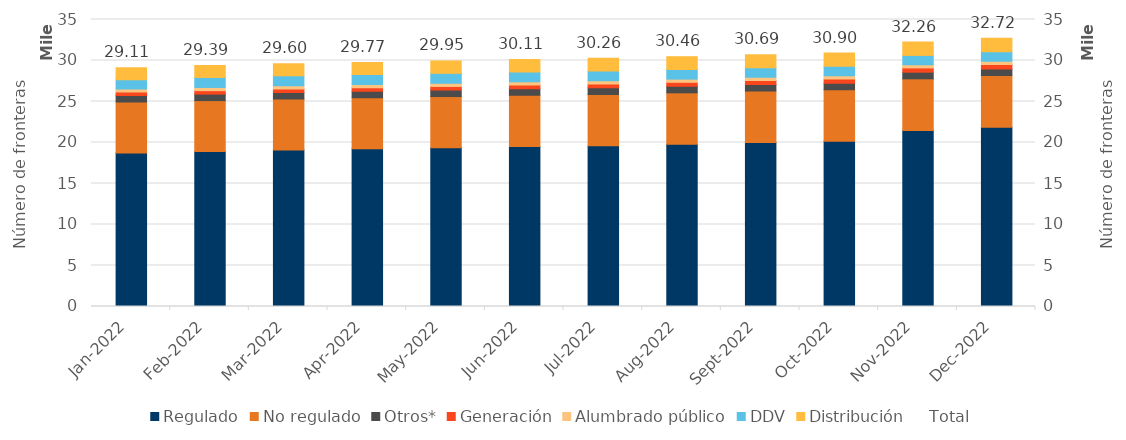
| Category | Regulado | No regulado | Otros* | Generación | Alumbrado público | DDV | Distribución |
|---|---|---|---|---|---|---|---|
| 2022-01-01 | 18718 | 6221 | 793 | 415 | 388 | 1132 | 1444 |
| 2022-02-01 | 18889 | 6220 | 793 | 422 | 389 | 1221 | 1458 |
| 2022-03-01 | 19080 | 6226 | 795 | 425 | 390 | 1223 | 1463 |
| 2022-04-01 | 19232 | 6225 | 794 | 429 | 387 | 1217 | 1483 |
| 2022-05-01 | 19375 | 6227 | 795 | 437 | 387 | 1215 | 1509 |
| 2022-06-01 | 19518 | 6243 | 797 | 457 | 387 | 1193 | 1516 |
| 2022-07-01 | 19609 | 6257 | 800 | 475 | 389 | 1197 | 1534 |
| 2022-08-01 | 19791 | 6266 | 803 | 481 | 389 | 1172 | 1562 |
| 2022-09-01 | 19998 | 6272 | 805 | 494 | 391 | 1151 | 1582 |
| 2022-10-01 | 20146 | 6283 | 806 | 505 | 386 | 1171 | 1607 |
| 2022-11-01 | 21478 | 6287 | 810 | 520 | 385 | 1139 | 1637 |
| 2022-12-01 | 21870 | 6289 | 818 | 539 | 385 | 1163 | 1653 |